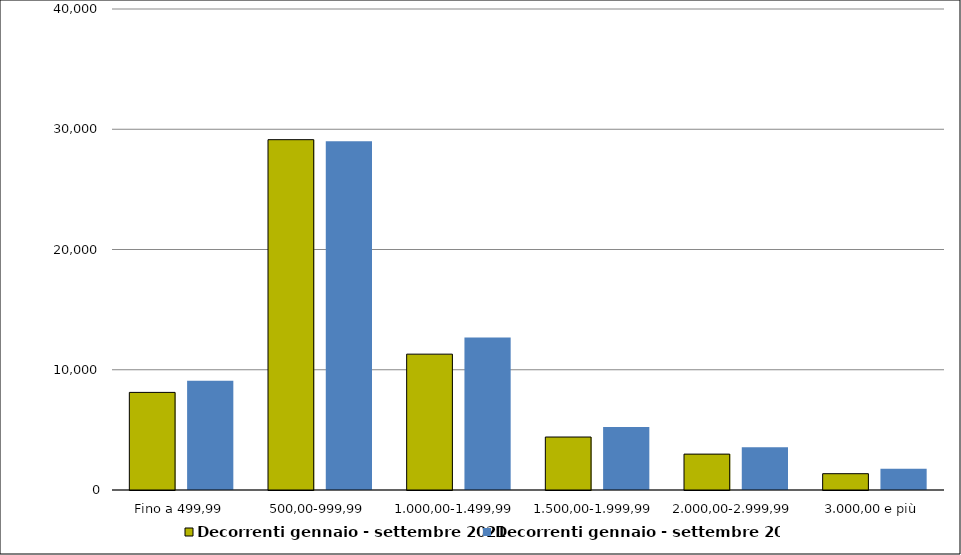
| Category | Decorrenti gennaio - settembre 2021 | Decorrenti gennaio - settembre 2020 |
|---|---|---|
|  Fino a 499,99  | 8116 | 9082 |
|  500,00-999,99  | 29133 | 28995 |
|  1.000,00-1.499,99  | 11297 | 12683 |
|  1.500,00-1.999,99  | 4405 | 5229 |
|  2.000,00-2.999,99  | 2984 | 3555 |
|  3.000,00 e più  | 1356 | 1760 |